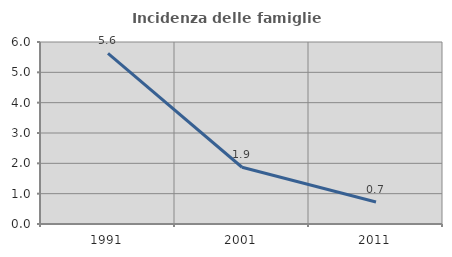
| Category | Incidenza delle famiglie numerose |
|---|---|
| 1991.0 | 5.628 |
| 2001.0 | 1.871 |
| 2011.0 | 0.726 |